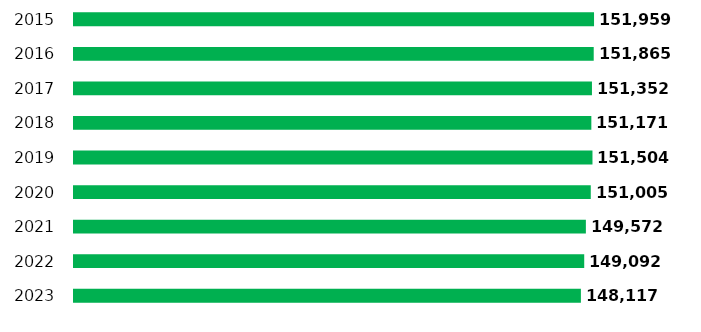
| Category | al 1° gennaio |
|---|---|
| 2023.0 | 148117 |
| 2022.0 | 149092 |
| 2021.0 | 149572 |
| 2020.0 | 151005 |
| 2019.0 | 151504 |
| 2018.0 | 151171 |
| 2017.0 | 151352 |
| 2016.0 | 151865 |
| 2015.0 | 151959 |